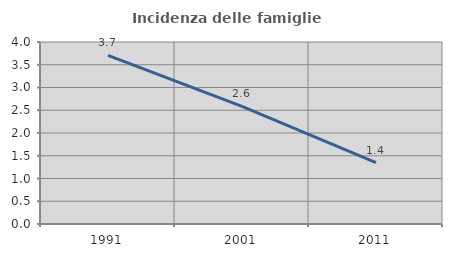
| Category | Incidenza delle famiglie numerose |
|---|---|
| 1991.0 | 3.708 |
| 2001.0 | 2.585 |
| 2011.0 | 1.35 |